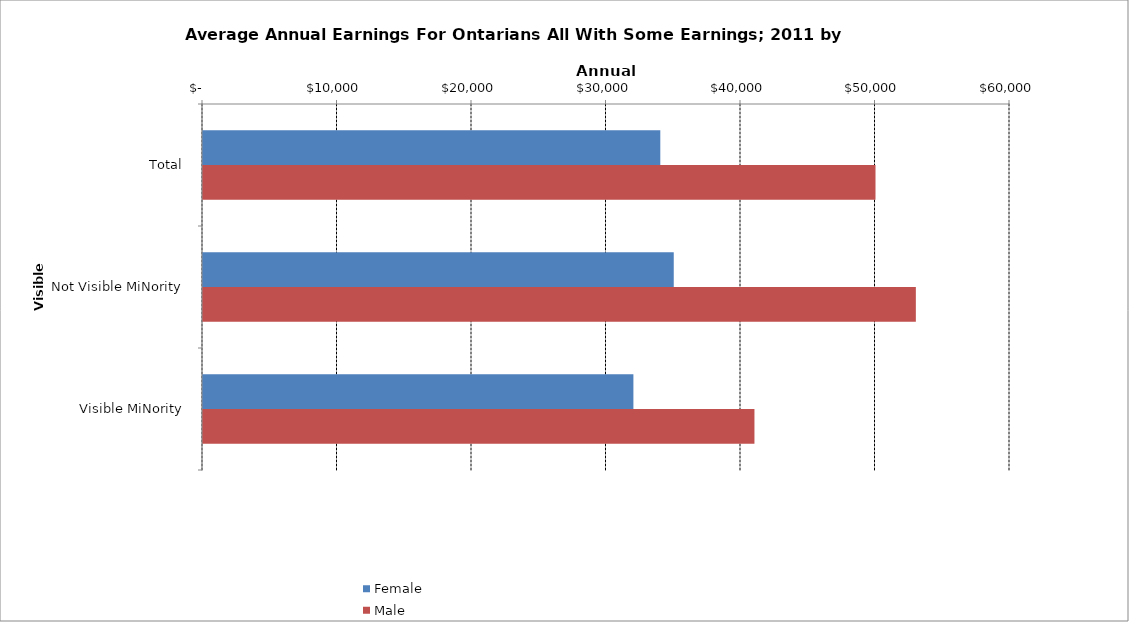
| Category | Female | Male |
|---|---|---|
| Total | 34000 | 50000 |
|  Not Visible MiNority  | 35000 | 53000 |
|  Visible MiNority  | 32000 | 41000 |